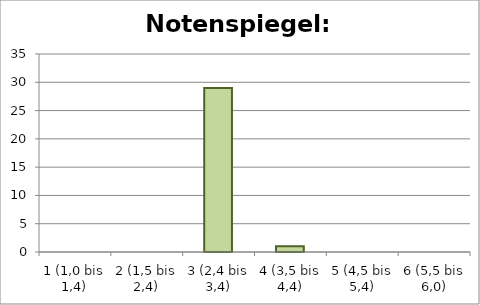
| Category | Series 0 |
|---|---|
| 1 (1,0 bis 1,4) | 0 |
| 2 (1,5 bis 2,4) | 0 |
| 3 (2,4 bis 3,4) | 29 |
| 4 (3,5 bis 4,4) | 1 |
| 5 (4,5 bis 5,4) | 0 |
| 6 (5,5 bis 6,0) | 0 |